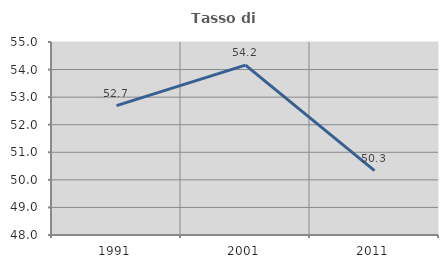
| Category | Tasso di occupazione   |
|---|---|
| 1991.0 | 52.694 |
| 2001.0 | 54.16 |
| 2011.0 | 50.336 |